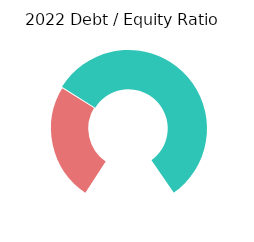
| Category | Series 1 |
|---|---|
| 0 | 39.589 |
| 1 | 90.411 |
| 2 | 30 |